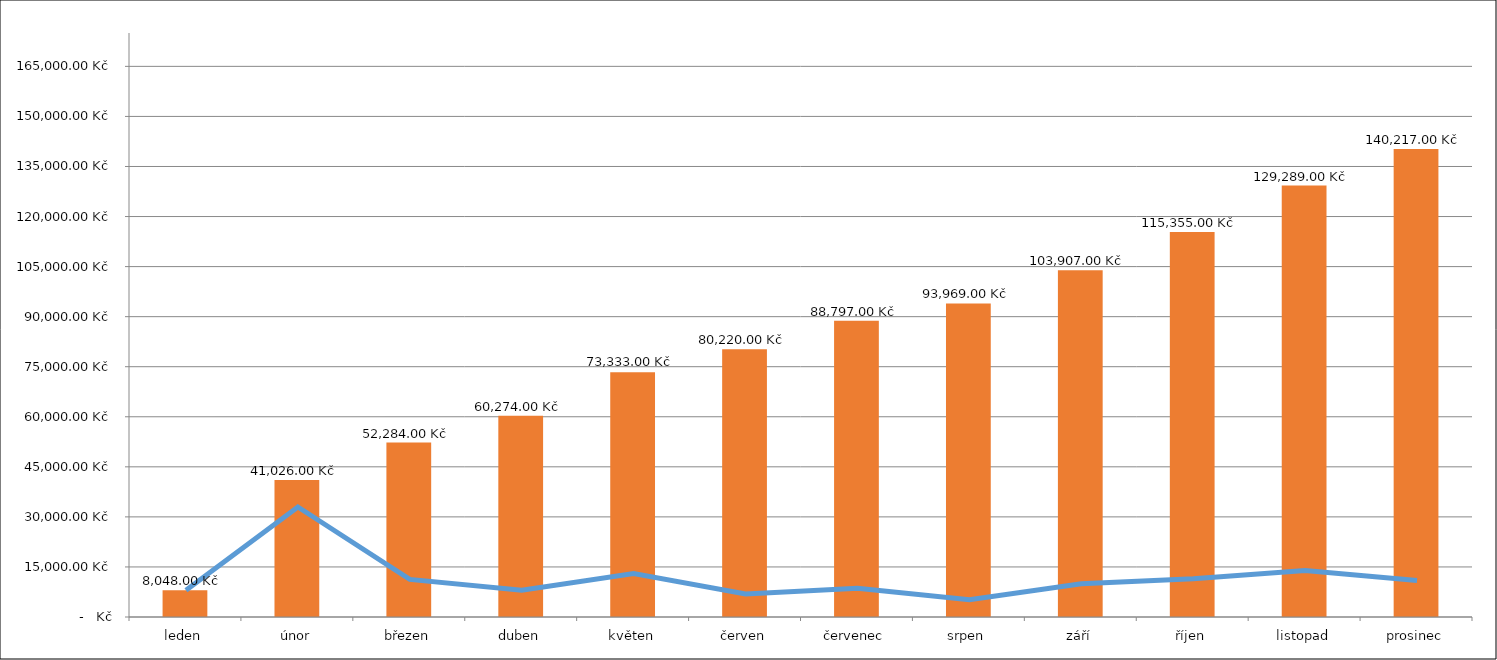
| Category | Series 1 |
|---|---|
| leden | 8048 |
| únor | 41026 |
| březen | 52284 |
| duben | 60274 |
| květen | 73333 |
| červen | 80220 |
| červenec | 88797 |
| srpen | 93969 |
| září | 103907 |
| říjen | 115355 |
| listopad | 129289 |
| prosinec | 140217 |